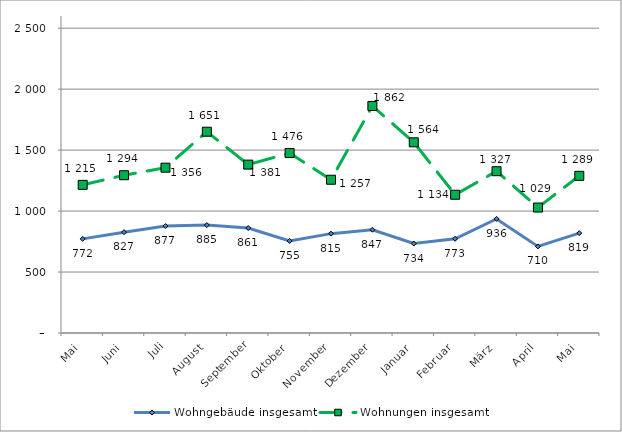
| Category | Wohngebäude insgesamt | Wohnungen insgesamt |
|---|---|---|
| Mai | 772 | 1215 |
| Juni | 827 | 1294 |
| Juli | 877 | 1356 |
| August | 885 | 1651 |
| September | 861 | 1381 |
| Oktober | 755 | 1476 |
| November | 815 | 1257 |
| Dezember | 847 | 1862 |
| Januar | 734 | 1564 |
| Februar | 773 | 1134 |
| März | 936 | 1327 |
| April | 710 | 1029 |
| Mai | 819 | 1289 |